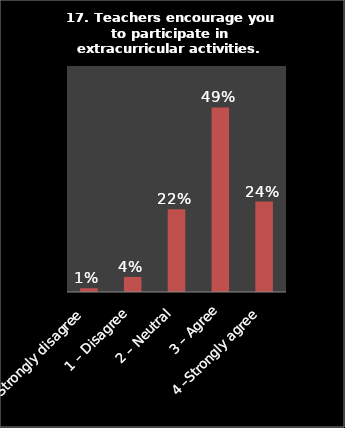
| Category | Series 0 |
|---|---|
| 0 – Strongly disagree | 0.01 |
| 1 – Disagree | 0.04 |
| 2 – Neutral | 0.22 |
| 3 – Agree | 0.49 |
| 4 –Strongly agree | 0.24 |